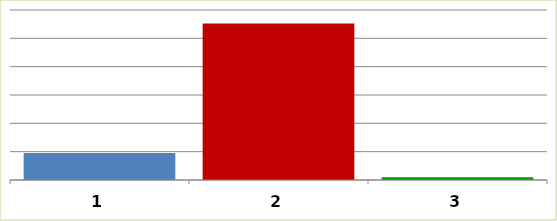
| Category | Series 0 |
|---|---|
| 0 | 9503018 |
| 1 | 55251265 |
| 2 | 1000000 |